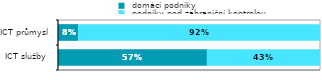
| Category |  domácí podniky |  podniky pod zahraniční kontrolou |
|---|---|---|
| ICT služby  | 0.568 | 0.432 |
| ICT průmysl | 0.077 | 0.923 |